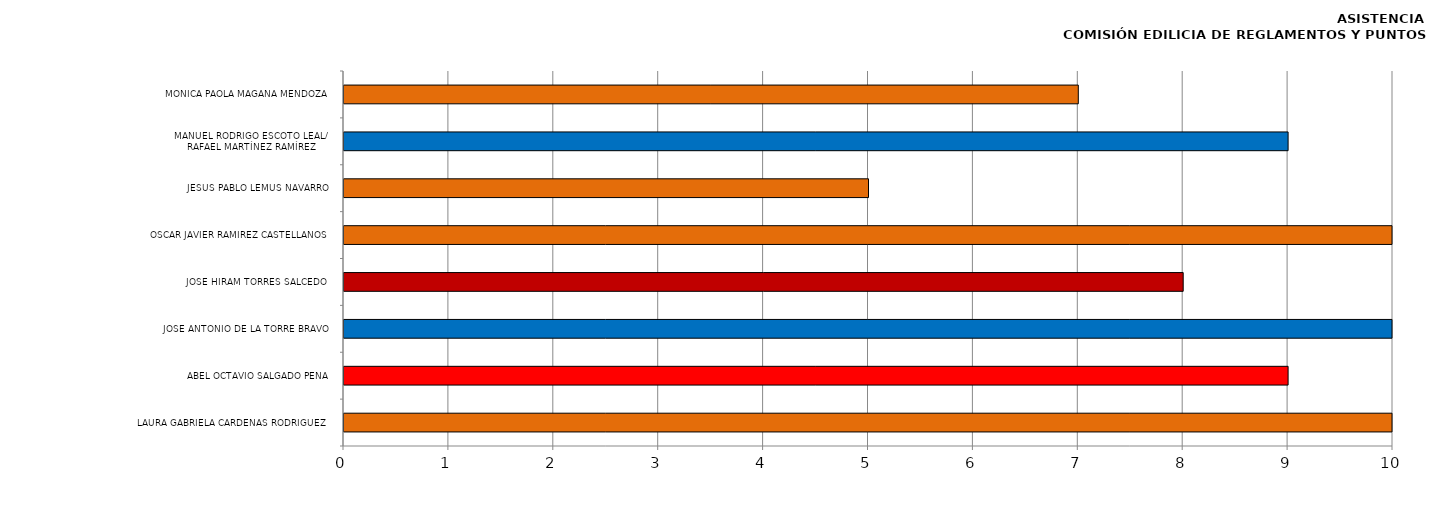
| Category | Series 0 |
|---|---|
| LAURA GABRIELA CÁRDENAS RODRÍGUEZ | 11 |
| ABEL OCTAVIO SALGADO PEÑA | 9 |
| JOSÉ ANTONIO DE LA TORRE BRAVO | 11 |
| JOSÉ HIRAM TORRES SALCEDO  | 8 |
| OSCAR JAVIER RAMÍREZ CASTELLANOS | 11 |
| JESÚS PABLO LEMUS NAVARRO | 5 |
| MANUEL RODRIGO ESCOTO LEAL/
RAFAEL MARTÍNEZ RAMÍREZ | 9 |
| MÓNICA PAOLA MAGAÑA MENDOZA | 7 |